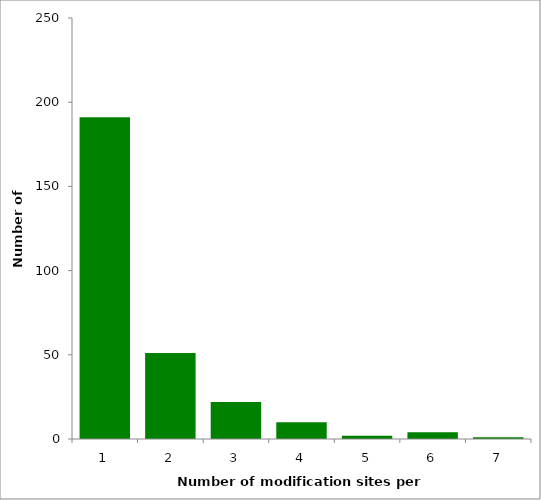
| Category | Series 0 |
|---|---|
| 1.0 | 191 |
| 2.0 | 51 |
| 3.0 | 22 |
| 4.0 | 10 |
| 5.0 | 2 |
| 6.0 | 4 |
| 7.0 | 1 |